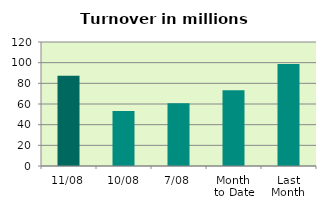
| Category | Series 0 |
|---|---|
| 11/08 | 87.349 |
| 10/08 | 53.125 |
| 7/08 | 60.826 |
| Month 
to Date | 73.297 |
| Last
Month | 98.668 |